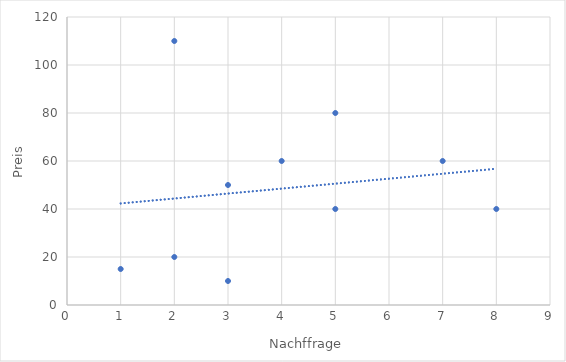
| Category | Series 0 |
|---|---|
| 3.0 | 50 |
| 2.0 | 110 |
| 4.0 | 60 |
| 5.0 | 80 |
| 8.0 | 40 |
| 7.0 | 60 |
| 5.0 | 40 |
| 3.0 | 10 |
| 2.0 | 20 |
| 1.0 | 15 |